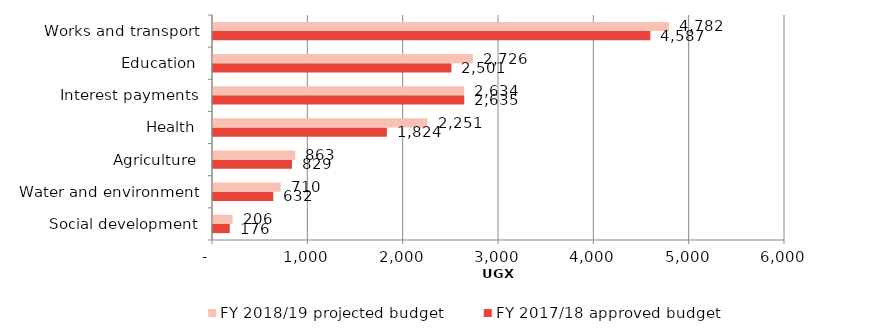
| Category | FY 2017/18 approved budget | FY 2018/19 projected budget  |
|---|---|---|
| Social development | 175.81 | 205.87 |
| Water and environment | 632.03 | 710.14 |
| Agriculture | 828.51 | 862.92 |
| Health | 1824.08 | 2250.55 |
| Interest payments | 2635.4 | 2634.11 |
| Education | 2501.12 | 2726.13 |
| Works and transport | 4587.27 | 4782.42 |